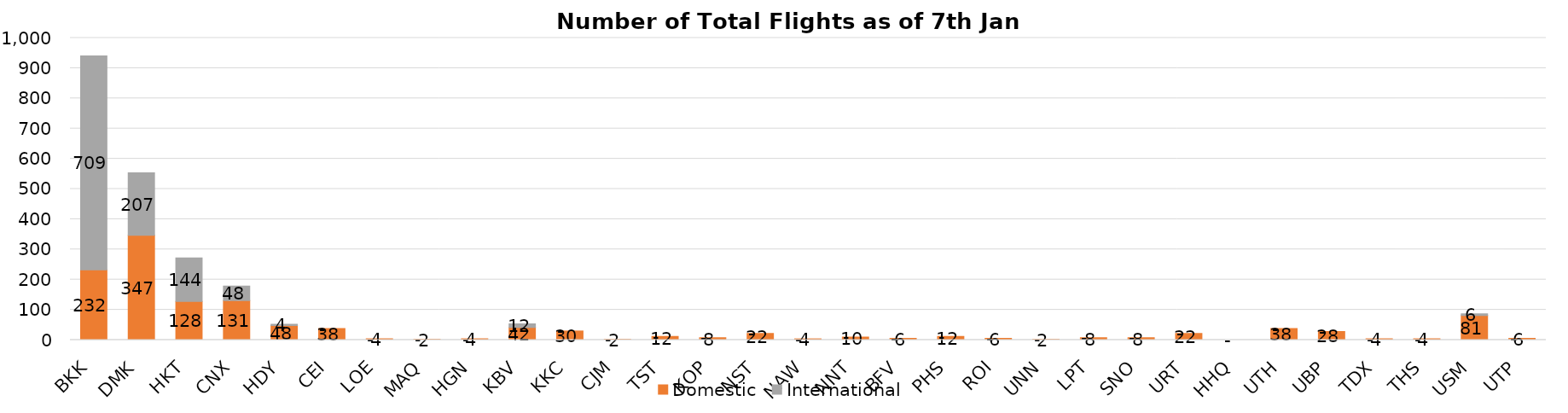
| Category | Domestic | International |
|---|---|---|
| BKK | 232 | 709 |
| DMK | 347 | 207 |
| HKT | 128 | 144 |
| CNX | 131 | 48 |
| HDY | 48 | 4 |
| CEI | 38 | 0 |
| LOE | 4 | 0 |
| MAQ | 2 | 0 |
| HGN | 4 | 0 |
| KBV | 42 | 12 |
| KKC | 30 | 0 |
| CJM | 2 | 0 |
| TST | 12 | 0 |
| KOP | 8 | 0 |
| NST | 22 | 0 |
| NAW | 4 | 0 |
| NNT | 10 | 0 |
| BFV | 6 | 0 |
| PHS | 12 | 0 |
| ROI | 6 | 0 |
| UNN | 2 | 0 |
| LPT | 8 | 0 |
| SNO | 8 | 0 |
| URT | 22 | 0 |
| HHQ | 0 | 0 |
| UTH | 38 | 0 |
| UBP | 28 | 0 |
| TDX | 4 | 0 |
| THS | 4 | 0 |
| USM | 81 | 6 |
| UTP | 6 | 0 |